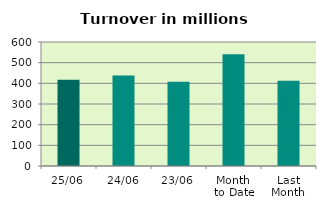
| Category | Series 0 |
|---|---|
| 25/06 | 416.907 |
| 24/06 | 438.469 |
| 23/06 | 407.8 |
| Month 
to Date | 541.121 |
| Last
Month | 412.236 |